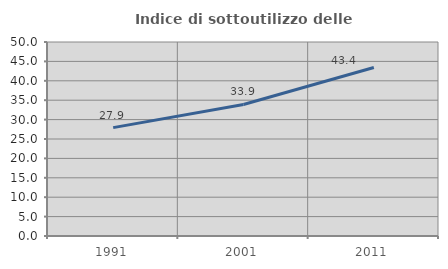
| Category | Indice di sottoutilizzo delle abitazioni  |
|---|---|
| 1991.0 | 27.934 |
| 2001.0 | 33.896 |
| 2011.0 | 43.418 |